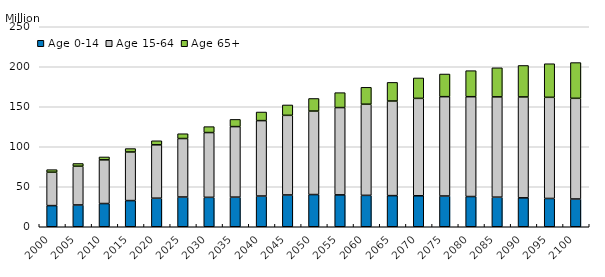
| Category | Age 0-14 | Age 15-64 | Age 65+ |
|---|---|---|---|
| 2000.0 | 26.43 | 41.747 | 3.195 |
| 2005.0 | 27.242 | 48.414 | 3.42 |
| 2010.0 | 29.039 | 54.599 | 3.614 |
| 2015.0 | 32.716 | 60.743 | 4.265 |
| 2020.0 | 35.689 | 66.716 | 5.06 |
| 2025.0 | 37.181 | 73.094 | 6.001 |
| 2030.0 | 36.772 | 80.973 | 7.407 |
| 2035.0 | 37.015 | 88.174 | 8.995 |
| 2040.0 | 38.404 | 94.27 | 10.749 |
| 2045.0 | 39.743 | 99.525 | 12.989 |
| 2050.0 | 40.266 | 104.353 | 15.721 |
| 2055.0 | 39.846 | 109.122 | 18.664 |
| 2060.0 | 39.252 | 113.931 | 21.129 |
| 2065.0 | 38.906 | 118.267 | 23.293 |
| 2070.0 | 38.724 | 121.748 | 25.542 |
| 2075.0 | 38.433 | 124.181 | 28.311 |
| 2080.0 | 37.792 | 124.785 | 32.535 |
| 2085.0 | 36.988 | 125.357 | 36.339 |
| 2090.0 | 36.135 | 126.134 | 39.341 |
| 2095.0 | 35.38 | 126.401 | 42.007 |
| 2100.0 | 34.7 | 125.84 | 44.685 |